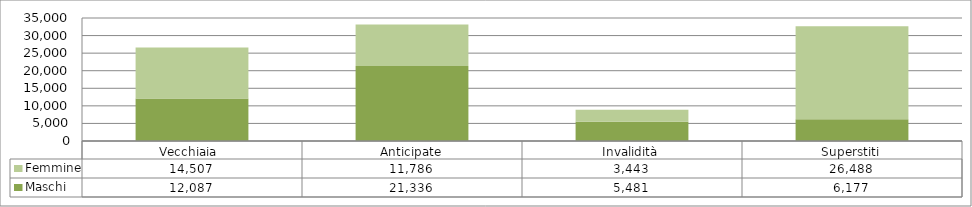
| Category | Maschi | Femmine |
|---|---|---|
| Vecchiaia  | 12087 | 14507 |
| Anticipate | 21336 | 11786 |
| Invalidità | 5481 | 3443 |
| Superstiti | 6177 | 26488 |